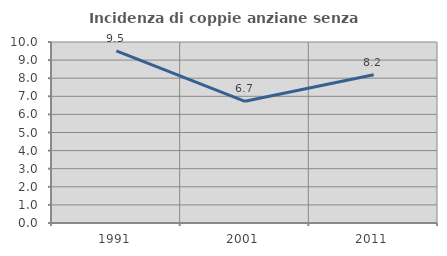
| Category | Incidenza di coppie anziane senza figli  |
|---|---|
| 1991.0 | 9.508 |
| 2001.0 | 6.725 |
| 2011.0 | 8.189 |